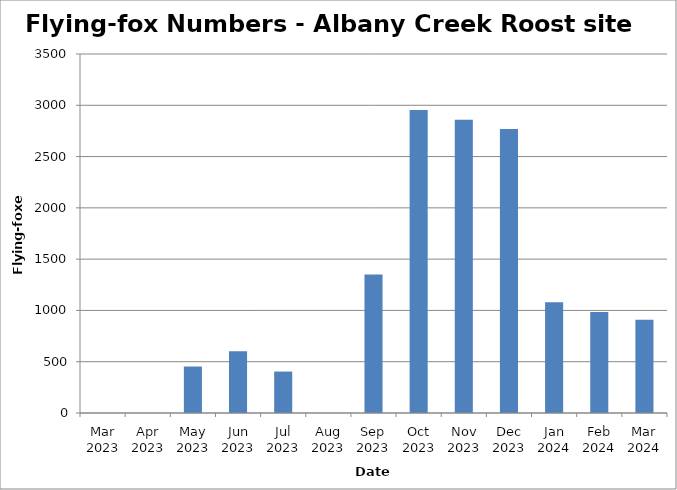
| Category | Flying-foxes |
|---|---|
| Mar 2023 | 0 |
| Apr 2023 | 0 |
| May 2023 | 453 |
| Jun 2023 | 603 |
| Jul 2023 | 404 |
| Aug 2023 | 0 |
| Sep 2023 | 1350 |
| Oct 2023 | 2954 |
| Nov 2023 | 2860 |
| Dec 2023 | 2768 |
| Jan 2024 | 1080 |
| Feb 2024 | 984 |
| Mar 2024 | 908 |